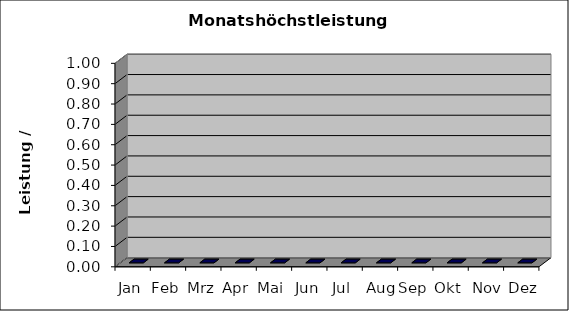
| Category | Leistung in kW |
|---|---|
| Jan | 0 |
| Feb | 0 |
| Mrz | 0 |
| Apr | 0 |
| Mai | 0 |
| Jun | 0 |
| Jul | 0 |
| Aug | 0 |
| Sep | 0 |
| Okt | 0 |
| Nov | 0 |
| Dez | 0 |